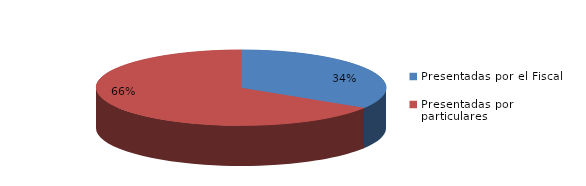
| Category | Series 0 |
|---|---|
| Presentadas por el Fiscal | 59 |
| Presentadas por particulares | 115 |